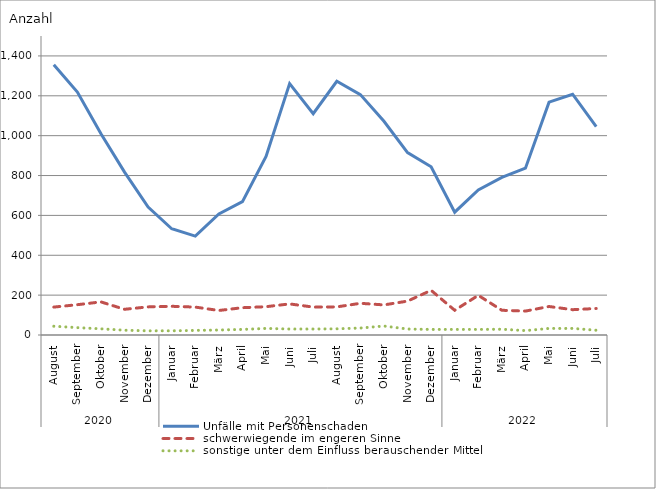
| Category | Unfälle mit Personenschaden | schwerwiegende im engeren Sinne | sonstige unter dem Einfluss berauschender Mittel |
|---|---|---|---|
| 0 | 1356 | 140 | 44 |
| 1 | 1219 | 152 | 37 |
| 2 | 1010 | 166 | 31 |
| 3 | 817 | 129 | 24 |
| 4 | 642 | 141 | 21 |
| 5 | 533 | 144 | 21 |
| 6 | 496 | 140 | 23 |
| 7 | 607 | 123 | 25 |
| 8 | 669 | 137 | 28 |
| 9 | 896 | 142 | 33 |
| 10 | 1261 | 156 | 30 |
| 11 | 1110 | 140 | 30 |
| 12 | 1273 | 141 | 31 |
| 13 | 1206 | 159 | 35 |
| 14 | 1072 | 151 | 45 |
| 15 | 915 | 170 | 30 |
| 16 | 844 | 224 | 28 |
| 17 | 616 | 124 | 28 |
| 18 | 728 | 199 | 28 |
| 19 | 791 | 124 | 29 |
| 20 | 837 | 120 | 22 |
| 21 | 1168 | 143 | 33 |
| 22 | 1208 | 127 | 33 |
| 23 | 1045 | 133 | 24 |